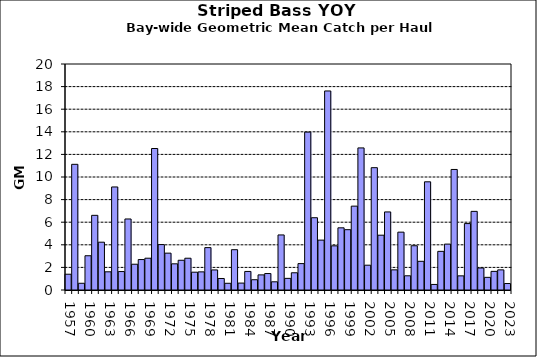
| Category | Series 0 |
|---|---|
| 1957.0 | 1.395 |
| 1958.0 | 11.122 |
| 1959.0 | 0.595 |
| 1960.0 | 3.032 |
| 1961.0 | 6.608 |
| 1962.0 | 4.231 |
| 1963.0 | 1.61 |
| 1964.0 | 9.119 |
| 1965.0 | 1.632 |
| 1966.0 | 6.285 |
| 1967.0 | 2.28 |
| 1968.0 | 2.694 |
| 1969.0 | 2.813 |
| 1970.0 | 12.522 |
| 1971.0 | 4.02 |
| 1972.0 | 3.261 |
| 1973.0 | 2.317 |
| 1974.0 | 2.631 |
| 1975.0 | 2.812 |
| 1976.0 | 1.575 |
| 1977.0 | 1.605 |
| 1978.0 | 3.751 |
| 1979.0 | 1.776 |
| 1980.0 | 1.018 |
| 1981.0 | 0.594 |
| 1982.0 | 3.567 |
| 1983.0 | 0.612 |
| 1984.0 | 1.641 |
| 1985.0 | 0.909 |
| 1986.0 | 1.338 |
| 1987.0 | 1.457 |
| 1988.0 | 0.725 |
| 1989.0 | 4.872 |
| 1990.0 | 1.029 |
| 1991.0 | 1.524 |
| 1992.0 | 2.337 |
| 1993.0 | 13.974 |
| 1994.0 | 6.397 |
| 1995.0 | 4.414 |
| 1996.0 | 17.614 |
| 1997.0 | 3.908 |
| 1998.0 | 5.503 |
| 1999.0 | 5.337 |
| 2000.0 | 7.422 |
| 2001.0 | 12.573 |
| 2002.0 | 2.195 |
| 2003.0 | 10.825 |
| 2004.0 | 4.85 |
| 2005.0 | 6.909 |
| 2006.0 | 1.783 |
| 2007.0 | 5.12 |
| 2008.0 | 1.258 |
| 2009.0 | 3.916 |
| 2010.0 | 2.539 |
| 2011.0 | 9.575 |
| 2012.0 | 0.491 |
| 2013.0 | 3.421 |
| 2014.0 | 4.062 |
| 2015.0 | 10.667 |
| 2016.0 | 1.252 |
| 2017.0 | 5.878 |
| 2018.0 | 6.959 |
| 2019.0 | 1.947 |
| 2020.0 | 1.12 |
| 2021.0 | 1.649 |
| 2022.0 | 1.782 |
| 2023.0 | 0.574 |